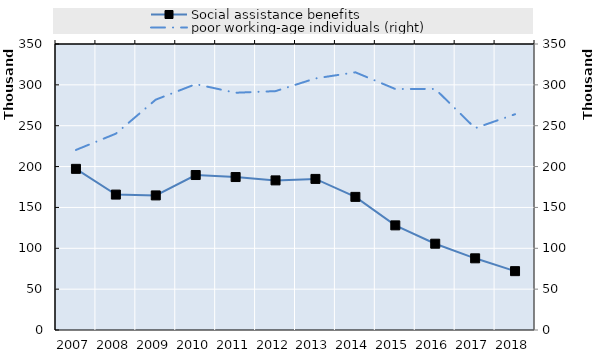
| Category | Social assistance benefits | Series 4 | Series 5 | Series 6 | Series 7 | Series 8 | Series 9 | Series 10 | Series 11 | Series 12 | Series 13 | Series 14 | Series 15 | Series 16 | Series 17 | Series 18 | Series 19 |
|---|---|---|---|---|---|---|---|---|---|---|---|---|---|---|---|---|---|
| 2007.0 | 197206.333 |  |  |  |  |  |  |  |  |  |  |  |  |  |  |  |  |
| 2008.0 | 165712.833 |  |  |  |  |  |  |  |  |  |  |  |  |  |  |  |  |
| 2009.0 | 164706.75 |  |  |  |  |  |  |  |  |  |  |  |  |  |  |  |  |
| 2010.0 | 189652.667 |  |  |  |  |  |  |  |  |  |  |  |  |  |  |  |  |
| 2011.0 | 187189 |  |  |  |  |  |  |  |  |  |  |  |  |  |  |  |  |
| 2012.0 | 183091 |  |  |  |  |  |  |  |  |  |  |  |  |  |  |  |  |
| 2013.0 | 184886 |  |  |  |  |  |  |  |  |  |  |  |  |  |  |  |  |
| 2014.0 | 162904 |  |  |  |  |  |  |  |  |  |  |  |  |  |  |  |  |
| 2015.0 | 128040 |  |  |  |  |  |  |  |  |  |  |  |  |  |  |  |  |
| 2016.0 | 105590 |  |  |  |  |  |  |  |  |  |  |  |  |  |  |  |  |
| 2017.0 | 87726.833 |  |  |  |  |  |  |  |  |  |  |  |  |  |  |  |  |
| 2018.0 | 72024.417 |  |  |  |  |  |  |  |  |  |  |  |  |  |  |  |  |